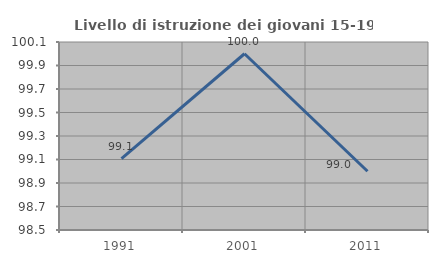
| Category | Livello di istruzione dei giovani 15-19 anni |
|---|---|
| 1991.0 | 99.107 |
| 2001.0 | 100 |
| 2011.0 | 99 |